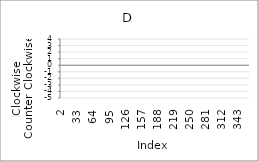
| Category | Series 0 |
|---|---|
| 2.0 | -1 |
| 3.0 | -3 |
| 4.0 | 2 |
| 5.0 | 1 |
| 6.0 | 0 |
| 7.0 | -3 |
| 8.0 | 4 |
| 9.0 | 3 |
| 10.0 | 0 |
| 11.0 | -4 |
| 12.0 | 2 |
| 13.0 | -1 |
| 14.0 | 3 |
| 15.0 | -3 |
| 16.0 | 2 |
| 17.0 | 3 |
| 18.0 | 4 |
| 19.0 | -4 |
| 20.0 | -5 |
| 21.0 | -2 |
| 22.0 | -5 |
| 23.0 | 4 |
| 24.0 | -3 |
| 25.0 | -4 |
| 26.0 | 1 |
| 27.0 | 0 |
| 28.0 | 0 |
| 29.0 | -5 |
| 30.0 | -5 |
| 31.0 | 99 |
| 32.0 | 99 |
| 33.0 | 99 |
| 34.0 | 99 |
| 35.0 | 99 |
| 36.0 | 99 |
| 37.0 | 99 |
| 38.0 | 99 |
| 39.0 | 99 |
| 40.0 | 99 |
| 41.0 | 99 |
| 42.0 | 99 |
| 43.0 | 99 |
| 44.0 | 99 |
| 45.0 | 99 |
| 46.0 | 99 |
| 47.0 | 99 |
| 48.0 | 99 |
| 49.0 | 99 |
| 50.0 | 99 |
| 51.0 | 99 |
| 52.0 | 99 |
| 53.0 | 99 |
| 54.0 | 99 |
| 55.0 | 99 |
| 56.0 | 99 |
| 57.0 | 99 |
| 58.0 | 99 |
| 59.0 | 99 |
| 60.0 | 99 |
| 61.0 | 99 |
| 62.0 | 99 |
| 63.0 | 99 |
| 64.0 | 99 |
| 65.0 | 99 |
| 66.0 | 99 |
| 67.0 | 99 |
| 68.0 | 99 |
| 69.0 | 99 |
| 70.0 | 99 |
| 71.0 | 99 |
| 72.0 | 99 |
| 73.0 | 99 |
| 74.0 | 99 |
| 75.0 | 99 |
| 76.0 | 99 |
| 77.0 | 99 |
| 78.0 | 99 |
| 79.0 | 99 |
| 80.0 | 99 |
| 81.0 | 99 |
| 82.0 | 99 |
| 83.0 | 99 |
| 84.0 | 99 |
| 85.0 | 99 |
| 86.0 | 99 |
| 87.0 | 99 |
| 88.0 | 99 |
| 89.0 | 99 |
| 90.0 | 99 |
| 91.0 | 99 |
| 92.0 | 99 |
| 93.0 | 99 |
| 94.0 | 99 |
| 95.0 | 99 |
| 96.0 | 99 |
| 97.0 | 99 |
| 98.0 | 99 |
| 99.0 | 99 |
| 100.0 | 99 |
| 101.0 | 99 |
| 102.0 | 99 |
| 103.0 | 99 |
| 104.0 | 99 |
| 105.0 | 99 |
| 106.0 | 99 |
| 107.0 | 99 |
| 108.0 | 99 |
| 109.0 | 99 |
| 110.0 | 99 |
| 111.0 | 99 |
| 112.0 | 99 |
| 113.0 | 99 |
| 114.0 | 99 |
| 115.0 | 99 |
| 116.0 | 99 |
| 117.0 | 99 |
| 118.0 | 99 |
| 119.0 | 99 |
| 120.0 | 99 |
| 121.0 | 99 |
| 122.0 | 99 |
| 123.0 | 99 |
| 124.0 | 99 |
| 125.0 | 99 |
| 126.0 | 99 |
| 127.0 | 99 |
| 128.0 | 99 |
| 129.0 | 99 |
| 130.0 | 99 |
| 131.0 | 99 |
| 132.0 | 99 |
| 133.0 | 99 |
| 134.0 | 99 |
| 135.0 | 99 |
| 136.0 | 99 |
| 137.0 | 99 |
| 138.0 | 99 |
| 139.0 | 99 |
| 140.0 | 99 |
| 141.0 | 99 |
| 142.0 | 99 |
| 143.0 | 99 |
| 144.0 | 99 |
| 145.0 | 99 |
| 146.0 | 99 |
| 147.0 | 99 |
| 148.0 | 99 |
| 149.0 | 99 |
| 150.0 | 99 |
| 151.0 | 99 |
| 152.0 | 99 |
| 153.0 | 99 |
| 154.0 | 99 |
| 155.0 | 99 |
| 156.0 | 99 |
| 157.0 | 99 |
| 158.0 | 99 |
| 159.0 | 99 |
| 160.0 | 99 |
| 161.0 | 99 |
| 162.0 | 99 |
| 163.0 | 99 |
| 164.0 | 99 |
| 165.0 | 99 |
| 166.0 | 99 |
| 167.0 | 99 |
| 168.0 | 99 |
| 169.0 | 99 |
| 170.0 | 99 |
| 171.0 | 99 |
| 172.0 | 99 |
| 173.0 | 99 |
| 174.0 | 99 |
| 175.0 | 99 |
| 176.0 | 99 |
| 177.0 | 99 |
| 178.0 | 99 |
| 179.0 | 99 |
| 180.0 | 99 |
| 181.0 | 99 |
| 182.0 | 99 |
| 183.0 | 99 |
| 184.0 | 99 |
| 185.0 | 99 |
| 186.0 | 99 |
| 187.0 | 99 |
| 188.0 | 99 |
| 189.0 | 99 |
| 190.0 | 99 |
| 191.0 | 99 |
| 192.0 | 99 |
| 193.0 | 99 |
| 194.0 | 99 |
| 195.0 | 99 |
| 196.0 | 99 |
| 197.0 | 99 |
| 198.0 | 99 |
| 199.0 | 99 |
| 200.0 | 99 |
| 201.0 | 99 |
| 202.0 | 99 |
| 203.0 | 99 |
| 204.0 | 99 |
| 205.0 | 99 |
| 206.0 | 99 |
| 207.0 | 99 |
| 208.0 | 99 |
| 209.0 | 99 |
| 210.0 | 99 |
| 211.0 | 99 |
| 212.0 | 99 |
| 213.0 | 99 |
| 214.0 | 99 |
| 215.0 | 99 |
| 216.0 | 99 |
| 217.0 | 99 |
| 218.0 | 99 |
| 219.0 | 99 |
| 220.0 | 99 |
| 221.0 | 99 |
| 222.0 | 99 |
| 223.0 | 99 |
| 224.0 | 99 |
| 225.0 | 99 |
| 226.0 | 99 |
| 227.0 | 99 |
| 228.0 | 99 |
| 229.0 | 99 |
| 230.0 | 99 |
| 231.0 | 99 |
| 232.0 | 99 |
| 233.0 | 99 |
| 234.0 | 99 |
| 235.0 | 99 |
| 236.0 | 99 |
| 237.0 | 99 |
| 238.0 | 99 |
| 239.0 | 99 |
| 240.0 | 99 |
| 241.0 | 99 |
| 242.0 | 99 |
| 243.0 | 99 |
| 244.0 | 99 |
| 245.0 | 99 |
| 246.0 | 99 |
| 247.0 | 99 |
| 248.0 | 99 |
| 249.0 | 99 |
| 250.0 | 99 |
| 251.0 | 99 |
| 252.0 | 99 |
| 253.0 | 99 |
| 254.0 | 99 |
| 255.0 | 99 |
| 256.0 | 99 |
| 257.0 | 99 |
| 258.0 | 99 |
| 259.0 | 99 |
| 260.0 | 99 |
| 261.0 | 99 |
| 262.0 | 99 |
| 263.0 | 99 |
| 264.0 | 99 |
| 265.0 | 99 |
| 266.0 | 99 |
| 267.0 | 99 |
| 268.0 | 99 |
| 269.0 | 99 |
| 270.0 | 99 |
| 271.0 | 99 |
| 272.0 | 99 |
| 273.0 | 99 |
| 274.0 | 99 |
| 275.0 | 99 |
| 276.0 | 99 |
| 277.0 | 99 |
| 278.0 | 99 |
| 279.0 | 99 |
| 280.0 | 99 |
| 281.0 | 99 |
| 282.0 | 99 |
| 283.0 | 99 |
| 284.0 | 99 |
| 285.0 | 99 |
| 286.0 | 99 |
| 287.0 | 99 |
| 288.0 | 99 |
| 289.0 | 99 |
| 290.0 | 99 |
| 291.0 | 99 |
| 292.0 | 99 |
| 293.0 | 99 |
| 294.0 | 99 |
| 295.0 | 99 |
| 296.0 | 99 |
| 297.0 | 99 |
| 298.0 | 99 |
| 299.0 | 99 |
| 300.0 | 99 |
| 301.0 | 99 |
| 302.0 | 99 |
| 303.0 | 99 |
| 304.0 | 99 |
| 305.0 | 99 |
| 306.0 | 99 |
| 307.0 | 99 |
| 308.0 | 99 |
| 309.0 | 99 |
| 310.0 | 99 |
| 311.0 | 99 |
| 312.0 | 99 |
| 313.0 | 99 |
| 314.0 | 99 |
| 315.0 | 99 |
| 316.0 | 99 |
| 317.0 | 99 |
| 318.0 | 99 |
| 319.0 | 99 |
| 320.0 | 99 |
| 321.0 | 99 |
| 322.0 | 99 |
| 323.0 | 99 |
| 324.0 | 99 |
| 325.0 | 99 |
| 326.0 | 99 |
| 327.0 | 99 |
| 328.0 | 99 |
| 329.0 | 99 |
| 330.0 | 99 |
| 331.0 | 99 |
| 332.0 | 99 |
| 333.0 | 99 |
| 334.0 | 99 |
| 335.0 | 99 |
| 336.0 | 99 |
| 337.0 | 99 |
| 338.0 | 99 |
| 339.0 | 99 |
| 340.0 | 99 |
| 341.0 | 99 |
| 342.0 | 99 |
| 343.0 | 99 |
| 344.0 | 99 |
| 345.0 | 99 |
| 346.0 | 99 |
| 347.0 | 99 |
| 348.0 | 99 |
| 349.0 | 99 |
| 350.0 | 99 |
| 351.0 | 99 |
| 352.0 | 99 |
| 353.0 | 99 |
| 354.0 | 99 |
| 355.0 | 99 |
| 356.0 | 99 |
| 357.0 | 99 |
| 358.0 | 99 |
| 359.0 | 99 |
| 360.0 | 99 |
| 361.0 | 99 |
| 362.0 | 99 |
| 363.0 | 99 |
| 364.0 | 99 |
| 365.0 | 99 |